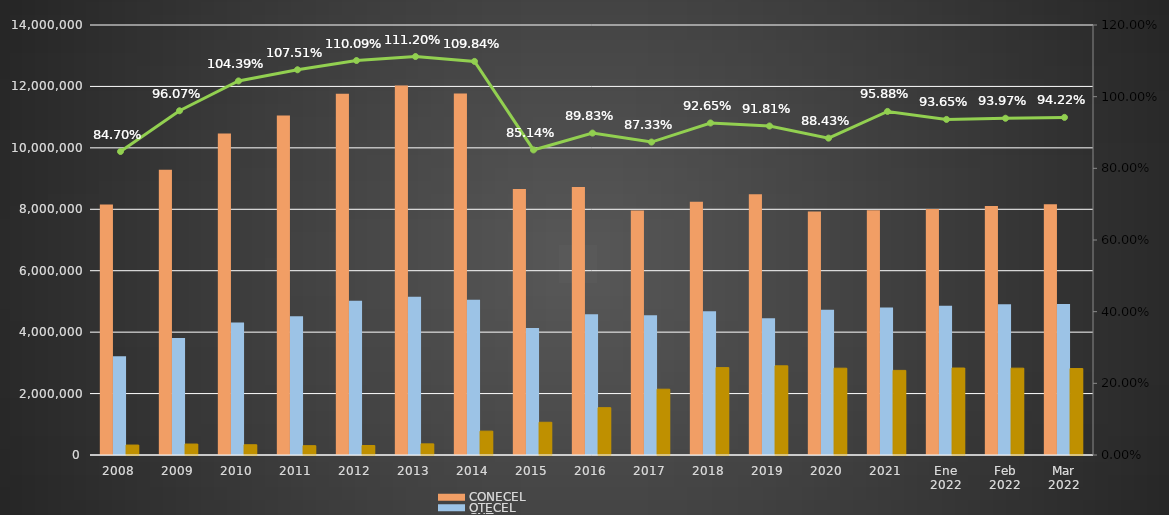
| Category | CONECEL | OTECEL | CNT |
|---|---|---|---|
| 2008 | 8156359 | 3211922 | 323967 |
| 2009 | 9291268 | 3806432 | 356900 |
| 2010 | 10470502 | 4314599 | 333730 |
| 2011 | 11057316 | 4513874 | 303368 |
| 2012 | 11757906 | 5019686 | 309271 |
| 2013 | 12030886 | 5148308 | 362560 |
| 2014 | 11772020 | 5055645 | 776892 |
| 2015 | 8658619 | 4134698 | 1065703 |
| 2016 | 8726823 | 4580092 | 1541219 |
| 2017 | 7960263 | 4549024 | 2142117 |
| 2018 | 8248050 | 4679646 | 2845142 |
| 2019 | 8493054 | 4456356 | 2903690 |
| 2020 | 7929253 | 4729725 | 2826388 |
| 2021 | 7965274 | 4800608 | 2755177 |
| Ene 2022 | 8012894 | 4856877 | 2831764 |
| Feb 2022 | 8103873 | 4909433 | 2827246 |
| Mar 2022 | 8163884 | 4915830 | 2814894 |